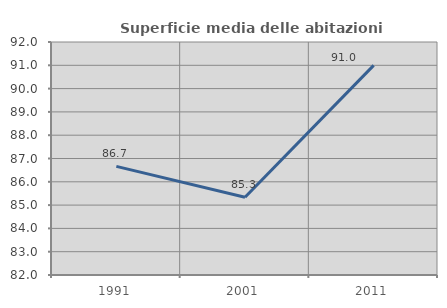
| Category | Superficie media delle abitazioni occupate |
|---|---|
| 1991.0 | 86.661 |
| 2001.0 | 85.338 |
| 2011.0 | 90.997 |